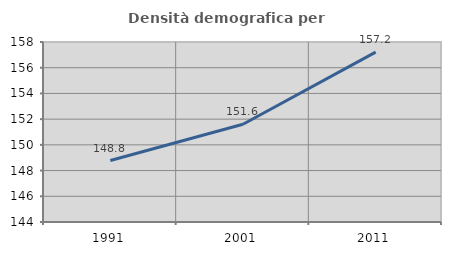
| Category | Densità demografica |
|---|---|
| 1991.0 | 148.78 |
| 2001.0 | 151.602 |
| 2011.0 | 157.21 |